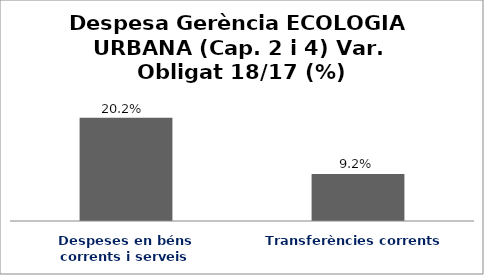
| Category | Series 0 |
|---|---|
| Despeses en béns corrents i serveis | 0.202 |
| Transferències corrents | 0.092 |